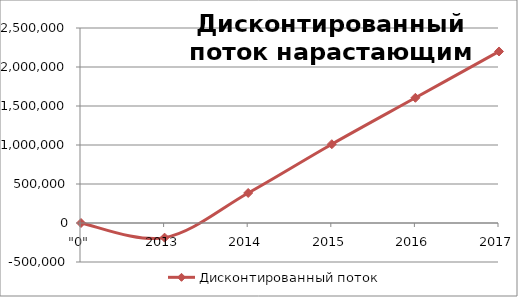
| Category | Дисконтированный поток нарастающим итогом |
|---|---|
| "0" | 0 |
| 2013 | -187728.269 |
| 2014 | 385005.815 |
| 2015 | 1010132.743 |
| 2016 | 1605106.288 |
| 2017 | 2199091.643 |